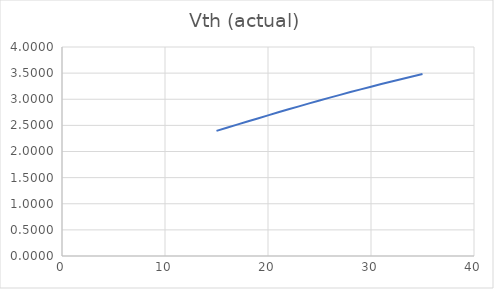
| Category | Vth (actual) |
|---|---|
| 15.0 | 2.394 |
| 16.0 | 2.454 |
| 17.0 | 2.514 |
| 18.0 | 2.573 |
| 19.0 | 2.633 |
| 20.0 | 2.691 |
| 21.0 | 2.75 |
| 22.0 | 2.807 |
| 23.0 | 2.864 |
| 24.0 | 2.92 |
| 25.0 | 2.976 |
| 26.0 | 3.031 |
| 27.0 | 3.084 |
| 28.0 | 3.137 |
| 29.0 | 3.189 |
| 30.0 | 3.24 |
| 31.0 | 3.291 |
| 32.0 | 3.34 |
| 33.0 | 3.388 |
| 34.0 | 3.436 |
| 35.0 | 3.482 |